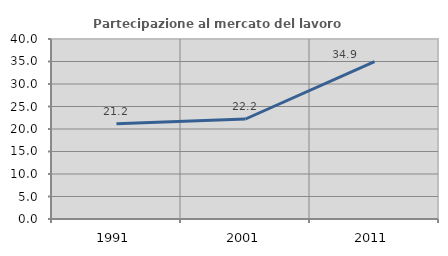
| Category | Partecipazione al mercato del lavoro  femminile |
|---|---|
| 1991.0 | 21.184 |
| 2001.0 | 22.222 |
| 2011.0 | 34.948 |